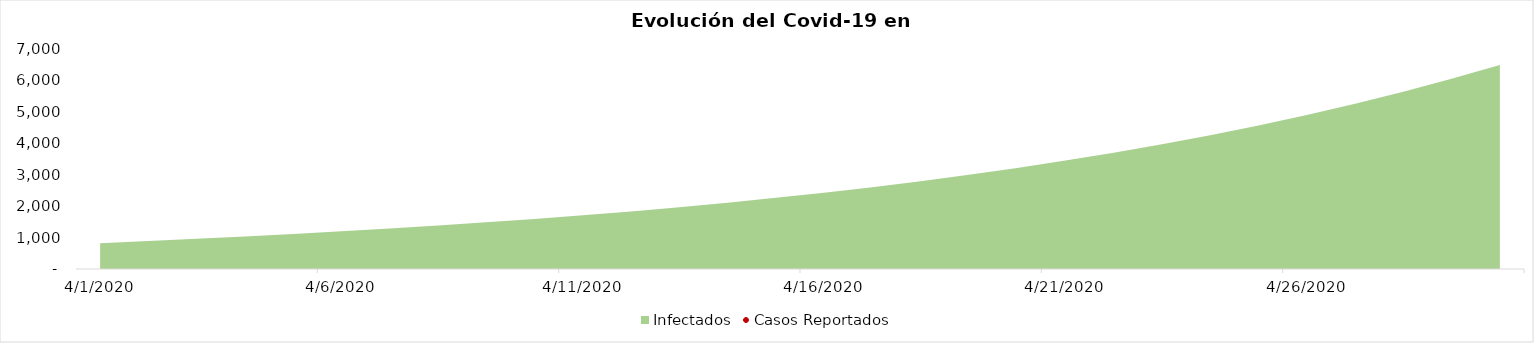
| Category | Infectados |
|---|---|
| 4/1/20 | 816.018 |
| 4/2/20 | 887.491 |
| 4/3/20 | 960.257 |
| 4/4/20 | 1035.674 |
| 4/5/20 | 1114.79 |
| 4/6/20 | 1198.453 |
| 4/7/20 | 1287.385 |
| 4/8/20 | 1382.235 |
| 4/9/20 | 1483.612 |
| 4/10/20 | 1592.112 |
| 4/11/20 | 1708.336 |
| 4/12/20 | 1832.901 |
| 4/13/20 | 1966.451 |
| 4/14/20 | 2109.667 |
| 4/15/20 | 2263.267 |
| 4/16/20 | 2428.02 |
| 4/17/20 | 2604.744 |
| 4/18/20 | 2794.316 |
| 4/19/20 | 2997.674 |
| 4/20/20 | 3215.822 |
| 4/21/20 | 3449.839 |
| 4/22/20 | 3700.88 |
| 4/23/20 | 3970.183 |
| 4/24/20 | 4259.078 |
| 4/25/20 | 4568.989 |
| 4/26/20 | 4901.445 |
| 4/27/20 | 5258.085 |
| 4/28/20 | 5640.668 |
| 4/29/20 | 6051.08 |
| 4/30/20 | 6491.344 |